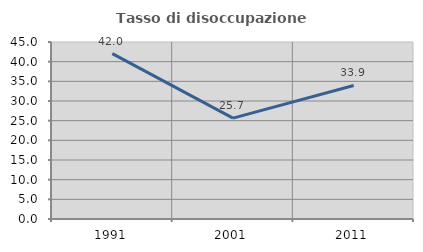
| Category | Tasso di disoccupazione giovanile  |
|---|---|
| 1991.0 | 42.045 |
| 2001.0 | 25.654 |
| 2011.0 | 33.945 |